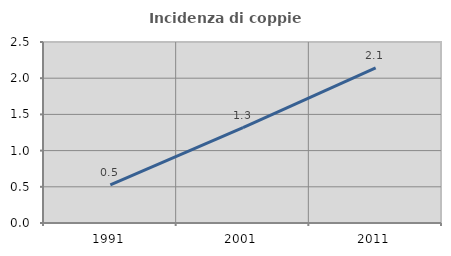
| Category | Incidenza di coppie miste |
|---|---|
| 1991.0 | 0.526 |
| 2001.0 | 1.317 |
| 2011.0 | 2.142 |